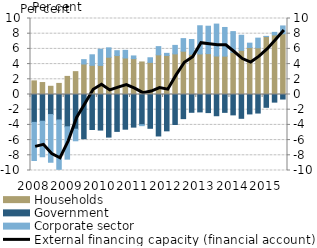
| Category | Households | Government | Corporate sector |
|---|---|---|---|
| 2008.0 | 1.791 | -3.668 | -5.019 |
| 2008.0 | 1.575 | -3.519 | -4.676 |
| 2008.0 | 1.081 | -2.641 | -6.273 |
| 2008.0 | 1.459 | -3.347 | -6.5 |
| 2009.0 | 2.381 | -4.251 | -4.254 |
| 2009.0 | 3.008 | -4.566 | -1.524 |
| 2009.0 | 4.012 | -5.823 | 0.573 |
| 2009.0 | 3.839 | -4.609 | 1.386 |
| 2010.0 | 3.83 | -4.68 | 2.128 |
| 2010.0 | 4.908 | -5.605 | 1.231 |
| 2010.0 | 5.126 | -4.854 | 0.638 |
| 2010.0 | 4.805 | -4.565 | 1.005 |
| 2011.0 | 4.72 | -4.293 | 0.354 |
| 2011.0 | 4.281 | -3.977 | -0.125 |
| 2011.0 | 4.226 | -4.447 | 0.608 |
| 2011.0 | 5.217 | -5.457 | 1.083 |
| 2012.0 | 5.142 | -4.782 | 0.273 |
| 2012.0 | 5.346 | -3.944 | 1.114 |
| 2012.0 | 5.699 | -3.176 | 1.655 |
| 2012.0 | 5.28 | -2.343 | 1.956 |
| 2013.0 | 5.337 | -2.292 | 3.708 |
| 2013.0 | 5.379 | -2.381 | 3.606 |
| 2013.0 | 5.067 | -2.794 | 4.197 |
| 2013.0 | 5.049 | -2.351 | 3.771 |
| 2014.0 | 5.562 | -2.682 | 2.713 |
| 2014.0 | 5.81 | -3.134 | 1.985 |
| 2014.0 | 6.184 | -2.557 | 0.572 |
| 2014.0 | 6.144 | -2.441 | 1.272 |
| 2015.0 | 7.619 | -1.685 | 0.03 |
| 2015.0 | 7.839 | -1.003 | 0.337 |
| 2015.0 | 7.985 | -0.597 | 1.036 |